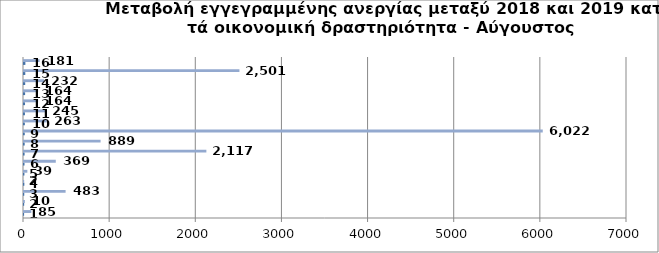
| Category | Series 0 | Series 1 |
|---|---|---|
| 0 | 1 | 85 |
| 1 | 2 | 10 |
| 2 | 3 | 483 |
| 3 | 4 | 2 |
| 4 | 5 | 39 |
| 5 | 6 | 369 |
| 6 | 7 | 2117 |
| 7 | 8 | 889 |
| 8 | 9 | 6022 |
| 9 | 10 | 263 |
| 10 | 11 | 245 |
| 11 | 12 | 164 |
| 12 | 13 | 164 |
| 13 | 14 | 232 |
| 14 | 15 | 2501 |
| 15 | 16 | 181 |